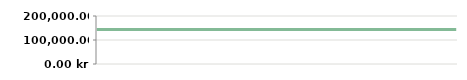
| Category | ÅR   |
|---|---|
| 2013-04-23 | 143800 |
| 2013-04-25 | 143800 |
| 2013-05-07 | 143800 |
| 2013-05-14 | 143800 |
| 2013-05-14 | 143800 |
| 2013-05-29 | 143800 |
| 2013-06-10 | 143800 |
| 2013-06-21 | 143800 |
| 2013-07-06 | 143800 |
| 2013-08-05 | 143800 |
| 2013-08-19 | 143800 |
| 2013-09-04 | 143800 |
| 2013-09-20 | 143800 |
| 2013-09-25 | 143800 |
| 2013-10-15 | 143800 |
| 2013-11-05 | 143800 |
| 2013-11-26 | 143800 |
| 2013-11-30 | 143800 |
| 2013-12-11 | 143800 |